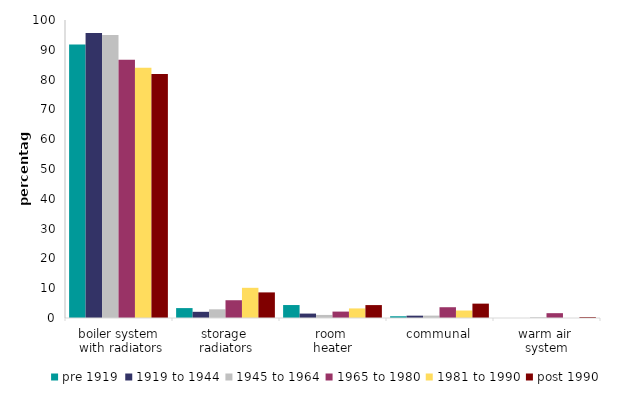
| Category | pre 1919 | 1919 to 1944 | 1945 to 1964 | 1965 to 1980 | 1981 to 1990 | post 1990 |
|---|---|---|---|---|---|---|
| boiler system
 with radiators | 91.74 | 95.655 | 94.988 | 86.649 | 83.983 | 81.892 |
| storage 
radiators | 3.325 | 2.075 | 2.918 | 5.962 | 10.13 | 8.59 |
| room 
heater | 4.35 | 1.484 | 1.025 | 2.15 | 3.214 | 4.334 |
| communal | 0.585 | 0.785 | 0.804 | 3.617 | 2.511 | 4.821 |
| warm air 
system | 0 | 0 | 0.264 | 1.621 | 0 | 0.343 |